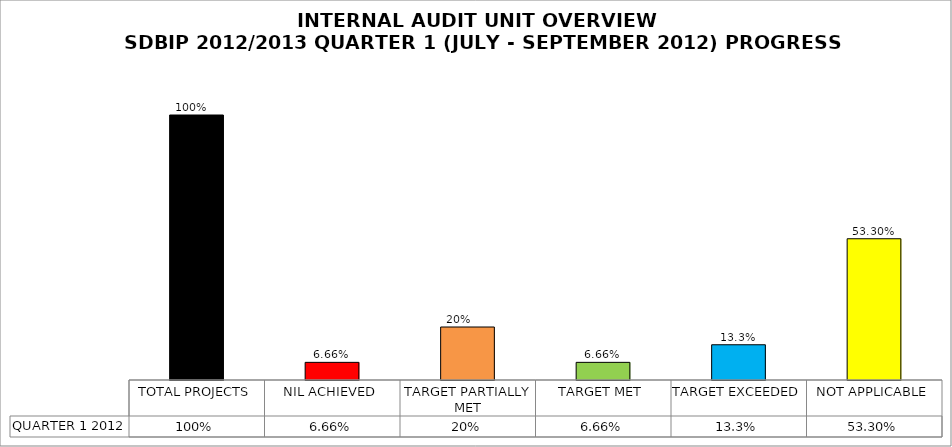
| Category | QUARTER 1 2012 |
|---|---|
| TOTAL PROJECTS | 1 |
| NIL ACHIEVED | 0.067 |
| TARGET PARTIALLY MET | 0.2 |
| TARGET MET | 0.067 |
| TARGET EXCEEDED | 0.133 |
| NOT APPLICABLE | 0.533 |